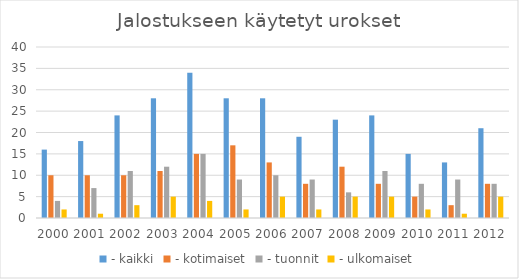
| Category | - kaikki | - kotimaiset | - tuonnit | - ulkomaiset |
|---|---|---|---|---|
| 2000.0 | 16 | 10 | 4 | 2 |
| 2001.0 | 18 | 10 | 7 | 1 |
| 2002.0 | 24 | 10 | 11 | 3 |
| 2003.0 | 28 | 11 | 12 | 5 |
| 2004.0 | 34 | 15 | 15 | 4 |
| 2005.0 | 28 | 17 | 9 | 2 |
| 2006.0 | 28 | 13 | 10 | 5 |
| 2007.0 | 19 | 8 | 9 | 2 |
| 2008.0 | 23 | 12 | 6 | 5 |
| 2009.0 | 24 | 8 | 11 | 5 |
| 2010.0 | 15 | 5 | 8 | 2 |
| 2011.0 | 13 | 3 | 9 | 1 |
| 2012.0 | 21 | 8 | 8 | 5 |